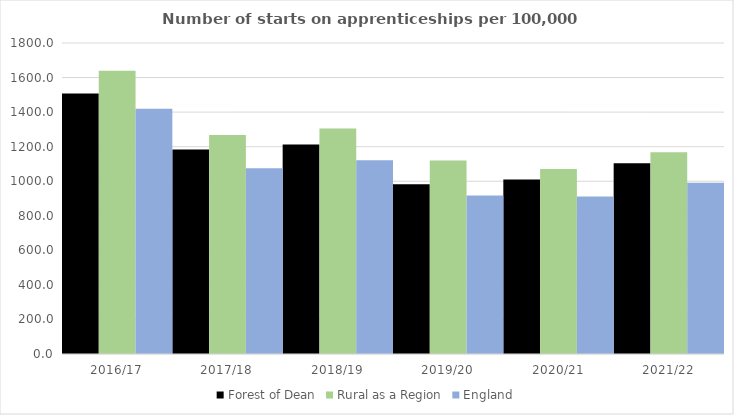
| Category | Forest of Dean | Rural as a Region | England |
|---|---|---|---|
| 2016/17 | 1507 | 1638.789 | 1420 |
| 2017/18 | 1183 | 1267.474 | 1075 |
| 2018/19 | 1213 | 1304.57 | 1122 |
| 2019/20 | 983 | 1119.662 | 918 |
| 2020/21 | 1010 | 1070.748 | 912 |
| 2021/22 | 1104 | 1167.68 | 991 |